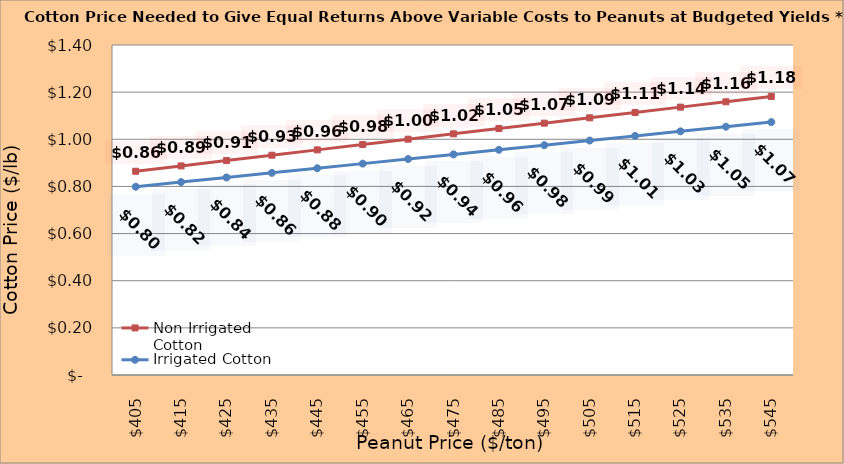
| Category | Non Irrigated Cotton | Irrigated Cotton |
|---|---|---|
| 405.0 | 0.864 | 0.799 |
| 415.0 | 0.887 | 0.818 |
| 425.0 | 0.91 | 0.838 |
| 435.0 | 0.932 | 0.858 |
| 445.0 | 0.955 | 0.877 |
| 455.0 | 0.978 | 0.897 |
| 465.0 | 1 | 0.916 |
| 475.0 | 1.023 | 0.936 |
| 485.0 | 1.046 | 0.955 |
| 495.0 | 1.068 | 0.975 |
| 505.0 | 1.091 | 0.995 |
| 515.0 | 1.114 | 1.014 |
| 525.0 | 1.136 | 1.034 |
| 535.0 | 1.159 | 1.053 |
| 545.0 | 1.182 | 1.073 |